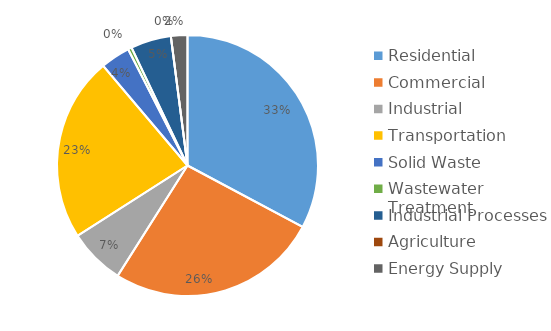
| Category | Series 0 |
|---|---|
| Residential | 19950806.844 |
| Commercial | 15927458.496 |
| Industrial | 4241091.089 |
| Transportation | 13914065.053 |
| Solid Waste | 2221187.223 |
| Wastewater Treatment | 286164.534 |
| Industrial Processes | 3047342.317 |
| Agriculture | 0 |
| Energy Supply | 1242123.241 |